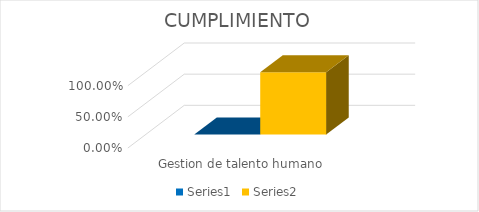
| Category | Series 1 | Series 2 |
|---|---|---|
| Gestion de talento humano  | 0 | 1 |